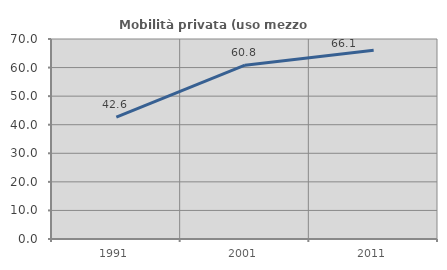
| Category | Mobilità privata (uso mezzo privato) |
|---|---|
| 1991.0 | 42.647 |
| 2001.0 | 60.819 |
| 2011.0 | 66.061 |